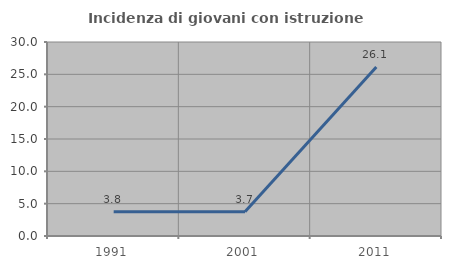
| Category | Incidenza di giovani con istruzione universitaria |
|---|---|
| 1991.0 | 3.759 |
| 2001.0 | 3.738 |
| 2011.0 | 26.136 |